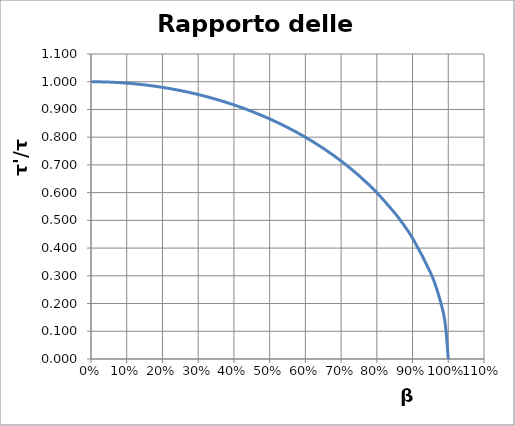
| Category | τ'/τ |
|---|---|
| 1e-60 | 1 |
| 0.05 | 0.999 |
| 0.1 | 0.995 |
| 0.15 | 0.989 |
| 0.2 | 0.98 |
| 0.25 | 0.968 |
| 0.3 | 0.954 |
| 0.35 | 0.937 |
| 0.4 | 0.917 |
| 0.45 | 0.893 |
| 0.5 | 0.866 |
| 0.55 | 0.835 |
| 0.6 | 0.8 |
| 0.65 | 0.76 |
| 0.7 | 0.714 |
| 0.75 | 0.661 |
| 0.8 | 0.6 |
| 0.85 | 0.527 |
| 0.8660066564121263 | 0.5 |
| 0.9 | 0.436 |
| 0.95 | 0.312 |
| 0.97 | 0.243 |
| 0.99 | 0.141 |
| 0.99999999999999 | 0 |